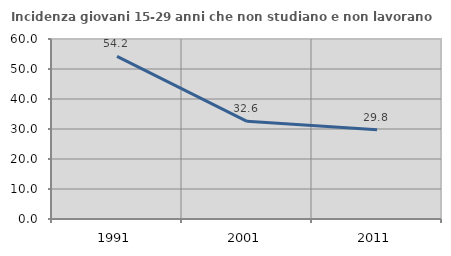
| Category | Incidenza giovani 15-29 anni che non studiano e non lavorano  |
|---|---|
| 1991.0 | 54.184 |
| 2001.0 | 32.563 |
| 2011.0 | 29.782 |